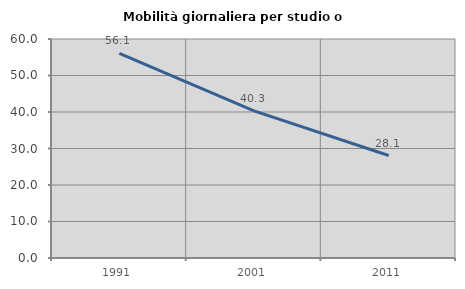
| Category | Mobilità giornaliera per studio o lavoro |
|---|---|
| 1991.0 | 56.061 |
| 2001.0 | 40.323 |
| 2011.0 | 28.07 |